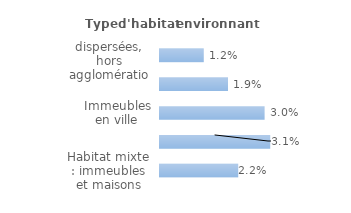
| Category | Series 0 |
|---|---|
| Maisons dispersées, hors agglomération | 0.012 |
| Maisons en lotissement, en quartier pavillonnaire | 0.019 |
| Immeubles en ville | 0.03 |
| Immeubles en cité ou grand ensemble | 0.031 |
| Habitat mixte : immeubles et maisons | 0.022 |